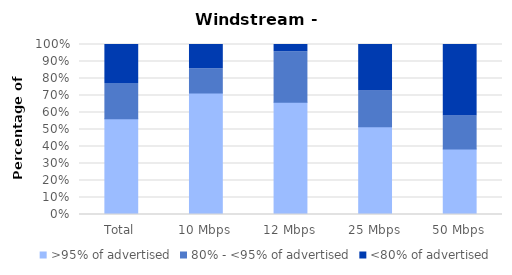
| Category | >95% of advertised | 80% - <95% of advertised | <80% of advertised |
|---|---|---|---|
| Total | 0.563 | 0.207 | 0.23 |
| 10 Mbps | 0.714 | 0.143 | 0.143 |
| 12 Mbps | 0.66 | 0.298 | 0.043 |
| 25 Mbps | 0.516 | 0.21 | 0.274 |
| 50 Mbps | 0.386 | 0.193 | 0.421 |